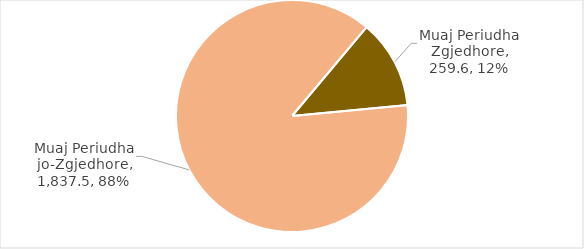
| Category | Total Grante |
|---|---|
| Muaj Periudha Zgjedhore | 259.642 |
| Muaj Periudha jo-Zgjedhore | 1837.519 |